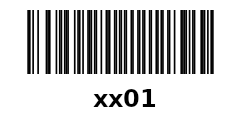
| Category | xx01        |
|---|---|
| Barcode 1 | 0 |